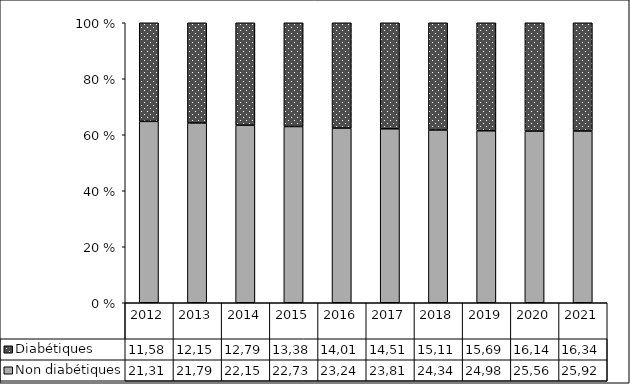
| Category | Non diabétiques | Diabétiques |
|---|---|---|
| 2012 | 21310 | 11585 |
| 2013 | 21791 | 12150 |
| 2014 | 22158 | 12794 |
| 2015 | 22738 | 13385 |
| 2016 | 23246 | 14018 |
| 2017 | 23817 | 14519 |
| 2018 | 24343 | 15110 |
| 2019 | 24983 | 15694 |
| 2020 | 25563 | 16149 |
| 2021 | 25928 | 16343 |